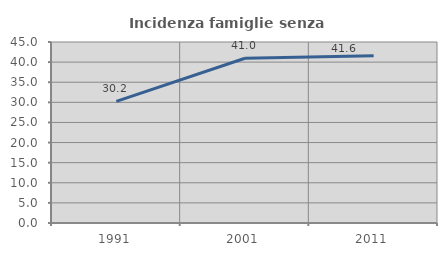
| Category | Incidenza famiglie senza nuclei |
|---|---|
| 1991.0 | 30.224 |
| 2001.0 | 40.968 |
| 2011.0 | 41.554 |